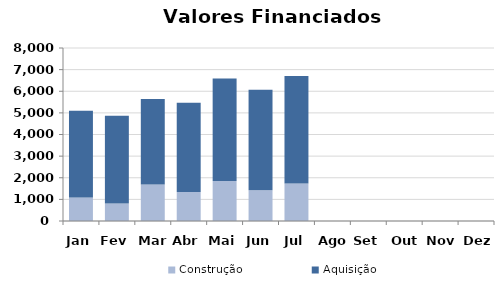
| Category | Construção | Aquisição  |
|---|---|---|
| Jan | 1091.225 | 4005.43 |
| Fev | 806.874 | 4059.044 |
| Mar | 1684.101 | 3954.739 |
| Abr | 1343.897 | 4119.704 |
| Mai | 1850.725 | 4740.725 |
| Jun | 1419.474 | 4644.895 |
| Jul | 1735.812 | 4964.527 |
| Ago | 0 | 0 |
| Set | 0 | 0 |
| Out | 0 | 0 |
| Nov | 0 | 0 |
| Dez | 0 | 0 |